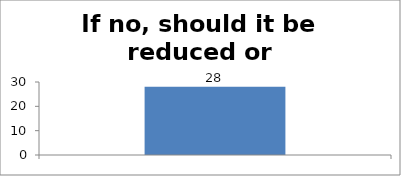
| Category | If no, should it be reduced or increased: |
|---|---|
| 0 | 28 |